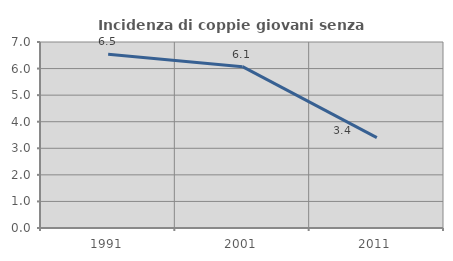
| Category | Incidenza di coppie giovani senza figli |
|---|---|
| 1991.0 | 6.537 |
| 2001.0 | 6.071 |
| 2011.0 | 3.401 |